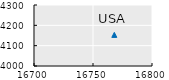
| Category | USA |
|---|---|
| 16768.053 | 4153.07 |